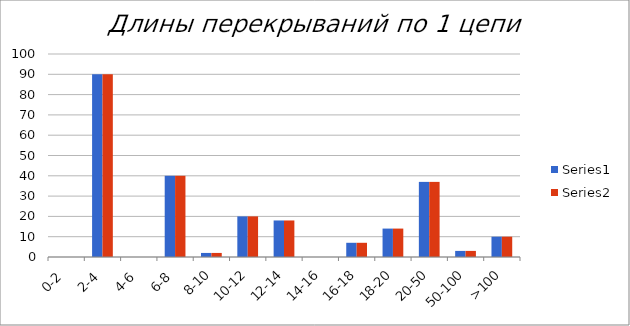
| Category | Series 0 | Series 1 |
|---|---|---|
| 0-2 | 0 | 0 |
| 2-4 | 90 | 90 |
| 4-6 | 0 | 0 |
| 6-8 | 40 | 40 |
| 8-10 | 2 | 2 |
| 10-12 | 20 | 20 |
| 12-14 | 18 | 18 |
| 14-16 | 0 | 0 |
| 16-18 | 7 | 7 |
| 18-20 | 14 | 14 |
| 20-50 | 37 | 37 |
| 50-100 | 3 | 3 |
| >100 | 10 | 10 |